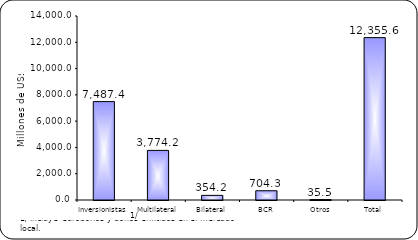
| Category | Series 1 |
|---|---|
| Inversionistas | 7487.4 |
| Multilateral | 3774.2 |
| Bilateral | 354.2 |
| BCR | 704.3 |
| Otros | 35.5 |
| Total | 12355.6 |